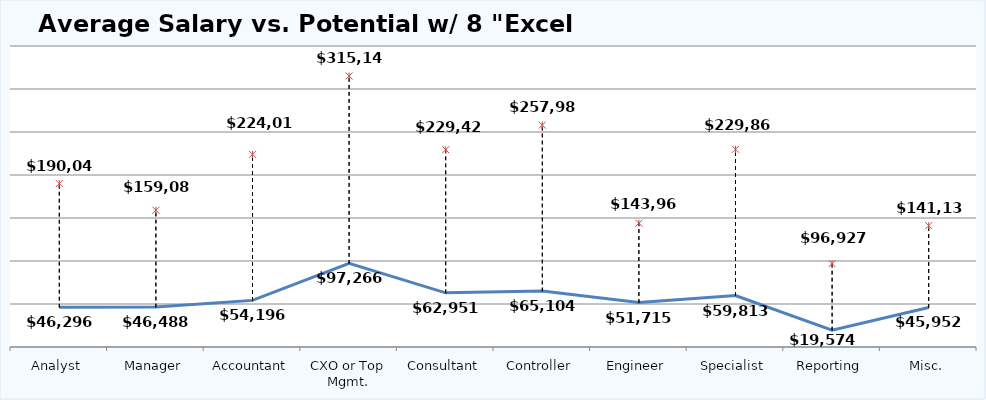
| Category | Series 0 | Series 1 |
|---|---|---|
| Analyst | 46295.769 | 190043.199 |
| Manager | 46488.241 | 159084.759 |
| Accountant | 54196.441 | 224011.954 |
| CXO or Top Mgmt. | 97265.876 | 315141.437 |
| Consultant | 62950.733 | 229420.45 |
| Controller | 65103.929 | 257986.465 |
| Engineer | 51715.151 | 143963.8 |
| Specialist | 59812.969 | 229869.451 |
| Reporting | 19574.159 | 96927.46 |
| Misc. | 45952.334 | 141139.312 |